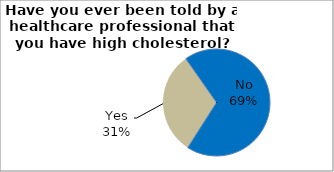
| Category | Series 0 |
|---|---|
| No | 68.74 |
| Yes | 31.26 |